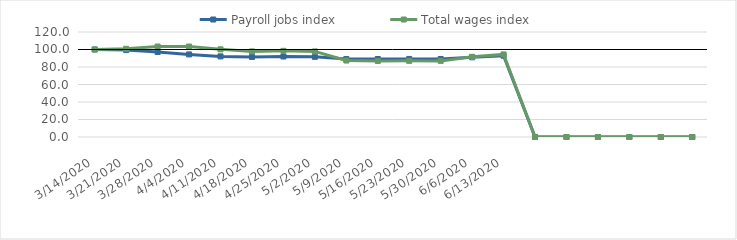
| Category | Payroll jobs index | Total wages index |
|---|---|---|
| 14/03/2020 | 100 | 100 |
| 21/03/2020 | 99.34 | 100.814 |
| 28/03/2020 | 97.104 | 103.404 |
| 04/04/2020 | 94.392 | 103.434 |
| 11/04/2020 | 92.14 | 100.175 |
| 18/04/2020 | 91.474 | 97.823 |
| 25/04/2020 | 91.971 | 98.434 |
| 02/05/2020 | 91.604 | 97.819 |
| 09/05/2020 | 89.086 | 87.362 |
| 16/05/2020 | 89.134 | 86.916 |
| 23/05/2020 | 89.201 | 87.025 |
| 30/05/2020 | 89.177 | 86.995 |
| 06/06/2020 | 91.082 | 91.634 |
| 13/06/2020 | 92.915 | 94.368 |